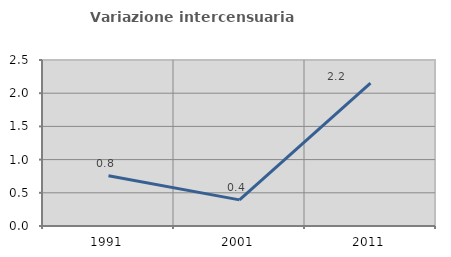
| Category | Variazione intercensuaria annua |
|---|---|
| 1991.0 | 0.756 |
| 2001.0 | 0.393 |
| 2011.0 | 2.15 |